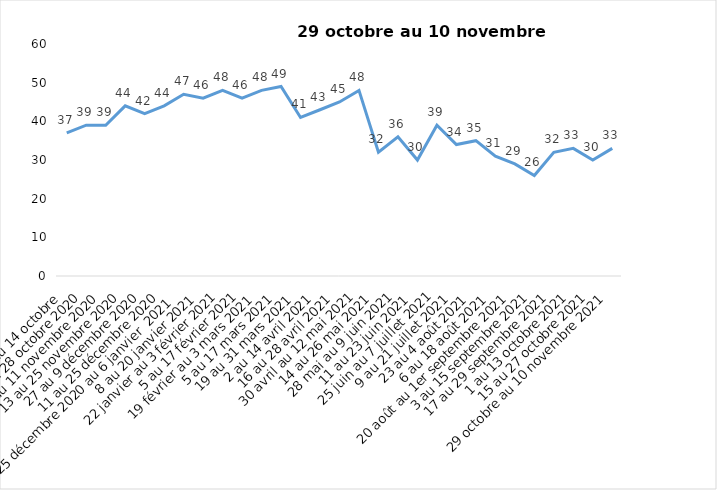
| Category | Toujours aux trois mesures |
|---|---|
| 2 au 14 octobre  | 37 |
| 16 au 28 octobre 2020 | 39 |
| 30 octobre au 11 novembre 2020 | 39 |
| 13 au 25 novembre 2020 | 44 |
| 27 au 9 décembre 2020 | 42 |
| 11 au 25 décembre 2020 | 44 |
| 25 décembre 2020 au 6 janvier  2021 | 47 |
| 8 au 20 janvier 2021 | 46 |
| 22 janvier au 3 février 2021 | 48 |
| 5 au 17 février 2021 | 46 |
| 19 février au 3 mars 2021 | 48 |
| 5 au 17 mars 2021 | 49 |
| 19 au 31 mars 2021 | 41 |
| 2 au 14 avril 2021 | 43 |
| 16 au 28 avril 2021 | 45 |
| 30 avril au 12 mai 2021 | 48 |
| 14 au 26 mai 2021 | 32 |
| 28 mai au 9 juin 2021 | 36 |
| 11 au 23 juin 2021 | 30 |
| 25 juin au 7 juillet 2021 | 39 |
| 9 au 21 juillet 2021 | 34 |
| 23 au 4 août 2021 | 35 |
| 6 au 18 août 2021 | 31 |
| 20 août au 1er septembre 2021 | 29 |
| 3 au 15 septembre 2021 | 26 |
| 17 au 29 septembre 2021 | 32 |
| 1 au 13 octobre 2021 | 33 |
| 15 au 27 octobre 2021 | 30 |
| 29 octobre au 10 novembre 2021 | 33 |